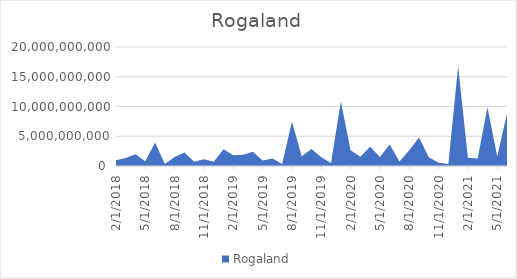
| Category | Rogaland |
|---|---|
| 2/1/18 | 971975000 |
| 3/1/18 | 1343800000 |
| 4/1/18 | 1966900000 |
| 5/1/18 | 791950000 |
| 6/1/18 | 3951675000 |
| 7/1/18 | 343950000 |
| 8/1/18 | 1510300000 |
| 9/1/18 | 2280520000 |
| 10/1/18 | 728330000 |
| 11/1/18 | 1140900000 |
| 12/1/18 | 720900000 |
| 1/1/19 | 2799480000 |
| 2/1/19 | 1791850000 |
| 3/1/19 | 1910650000 |
| 4/1/19 | 2403000000 |
| 5/1/19 | 920300000 |
| 6/1/19 | 1248850000 |
| 7/1/19 | 353750000 |
| 8/1/19 | 7468550000 |
| 9/1/19 | 1636000000 |
| 10/1/19 | 2849730000 |
| 11/1/19 | 1491500000 |
| 12/1/19 | 487000000 |
| 1/1/20 | 10824340000 |
| 2/1/20 | 2627500000 |
| 3/1/20 | 1566220000 |
| 4/1/20 | 3229050000 |
| 5/1/20 | 1512250000 |
| 6/1/20 | 3621675000 |
| 7/1/20 | 772600000 |
| 8/1/20 | 2636850000 |
| 9/1/20 | 4785760000 |
| 10/1/20 | 1456650000 |
| 11/1/20 | 551020000 |
| 12/1/20 | 334570000 |
| 1/1/21 | 16747775000 |
| 2/1/21 | 1382100000 |
| 3/1/21 | 1259750000 |
| 4/1/21 | 9857250000 |
| 5/1/21 | 1588150000 |
| 6/1/21 | 8811350000 |